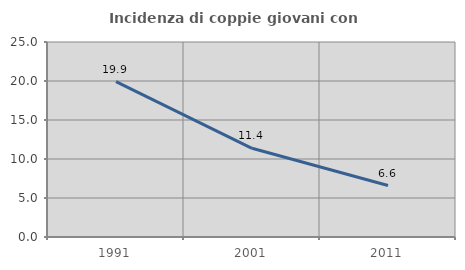
| Category | Incidenza di coppie giovani con figli |
|---|---|
| 1991.0 | 19.922 |
| 2001.0 | 11.37 |
| 2011.0 | 6.596 |